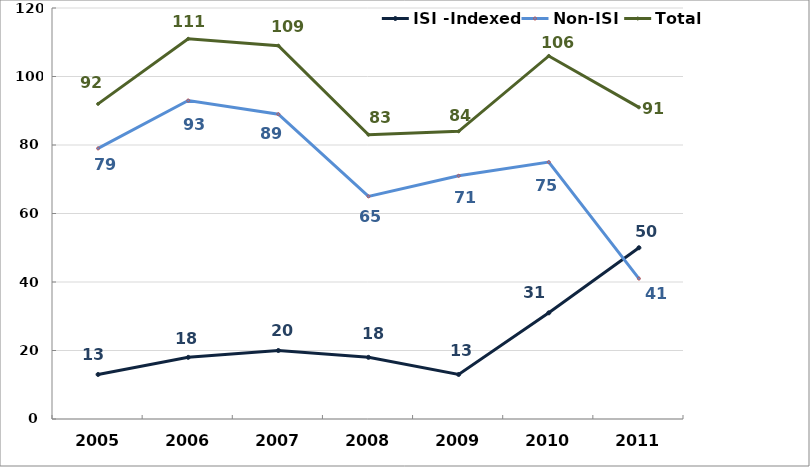
| Category | ISI -Indexed | Non-ISI | Total |
|---|---|---|---|
| 2005.0 | 13 | 79 | 92 |
| 2006.0 | 18 | 93 | 111 |
| 2007.0 | 20 | 89 | 109 |
| 2008.0 | 18 | 65 | 83 |
| 2009.0 | 13 | 71 | 84 |
| 2010.0 | 31 | 75 | 106 |
| 2011.0 | 50 | 41 | 91 |